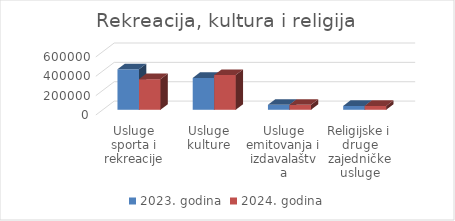
| Category | 2023. godina | 2024. godina |
|---|---|---|
| Usluge sporta i rekreacije | 418000 | 316000 |
| Usluge kulture | 329000 | 359000 |
| Usluge emitovanja i izdavalaštva | 50860 | 50860 |
| Religijske i druge zajedničke usluge | 40000 | 40000 |